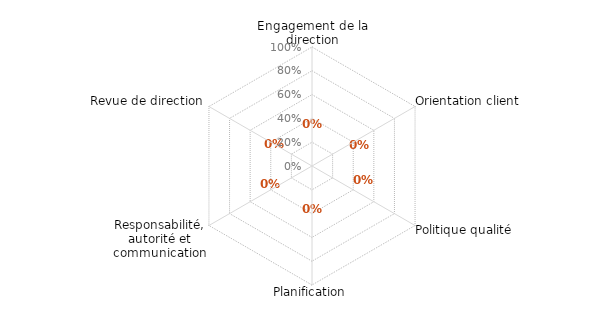
| Category | article 5 |
|---|---|
| 0 | 0 |
| 1 | 0 |
| 2 | 0 |
| 3 | 0 |
| 4 | 0 |
| 5 | 0 |